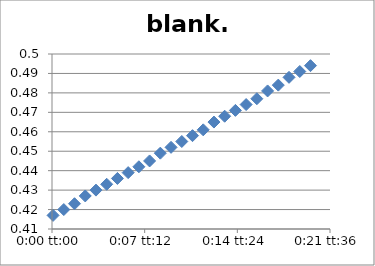
| Category | blank.2 |
|---|---|
| 5.78703703703704e-05 | 0.417 |
| 0.000636574074074074 | 0.42 |
| 0.00121527777777778 | 0.423 |
| 0.00179398148148148 | 0.427 |
| 0.00237268518518518 | 0.43 |
| 0.00295138888888889 | 0.433 |
| 0.00353009259259259 | 0.436 |
| 0.0041087962962963 | 0.439 |
| 0.0046875 | 0.442 |
| 0.0052662037037037 | 0.445 |
| 0.00584490740740741 | 0.449 |
| 0.00642361111111111 | 0.452 |
| 0.00700231481481481 | 0.455 |
| 0.00758101851851852 | 0.458 |
| 0.00815972222222222 | 0.461 |
| 0.00873842592592592 | 0.465 |
| 0.00931712962962963 | 0.468 |
| 0.00989583333333333 | 0.471 |
| 0.010474537037037 | 0.474 |
| 0.0110532407407407 | 0.477 |
| 0.0116319444444444 | 0.481 |
| 0.0122106481481481 | 0.484 |
| 0.0127893518518518 | 0.488 |
| 0.0133680555555556 | 0.491 |
| 0.0139467592592593 | 0.494 |